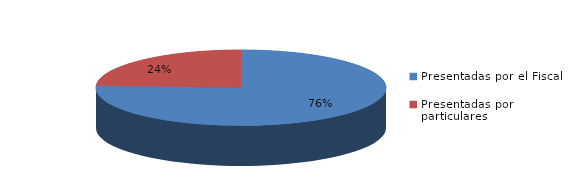
| Category | Series 0 |
|---|---|
| Presentadas por el Fiscal | 292 |
| Presentadas por particulares | 93 |